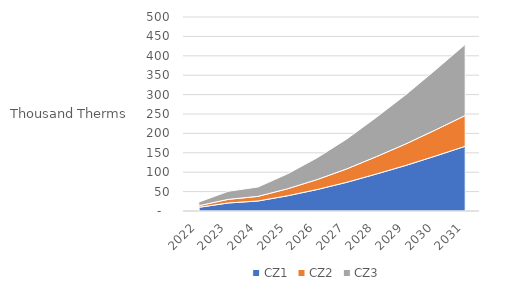
| Category | CZ1 | CZ2 | CZ3 |
|---|---|---|---|
| 2022.0 | 9.516 | 4.234 | 9.279 |
| 2023.0 | 20.718 | 9.35 | 20.783 |
| 2024.0 | 25.83 | 11.889 | 24.117 |
| 2025.0 | 39.238 | 18.141 | 38.433 |
| 2026.0 | 55.36 | 25.738 | 56.084 |
| 2027.0 | 74 | 34.597 | 77.015 |
| 2028.0 | 95.346 | 44.825 | 101.354 |
| 2029.0 | 117.629 | 55.555 | 126.937 |
| 2030.0 | 141.826 | 67.274 | 154.705 |
| 2031.0 | 166.734 | 79.421 | 183.167 |